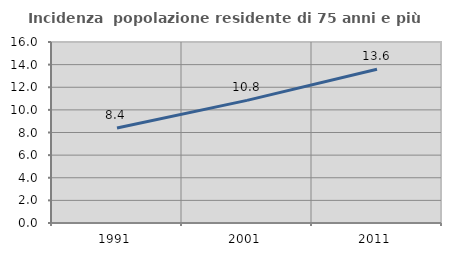
| Category | Incidenza  popolazione residente di 75 anni e più |
|---|---|
| 1991.0 | 8.406 |
| 2001.0 | 10.838 |
| 2011.0 | 13.584 |